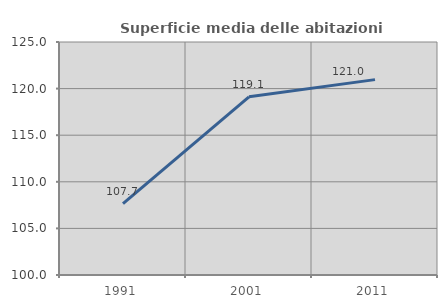
| Category | Superficie media delle abitazioni occupate |
|---|---|
| 1991.0 | 107.655 |
| 2001.0 | 119.117 |
| 2011.0 | 120.964 |